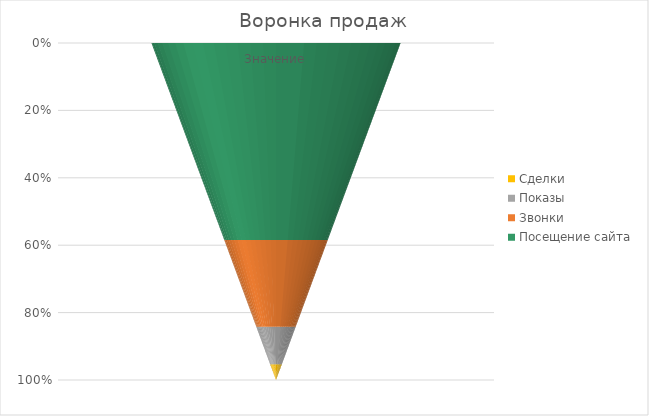
| Category | Посещение сайта | Звонки | Показы | Сделки |
|---|---|---|---|---|
| Значение | 5000 | 2200 | 950 | 400 |